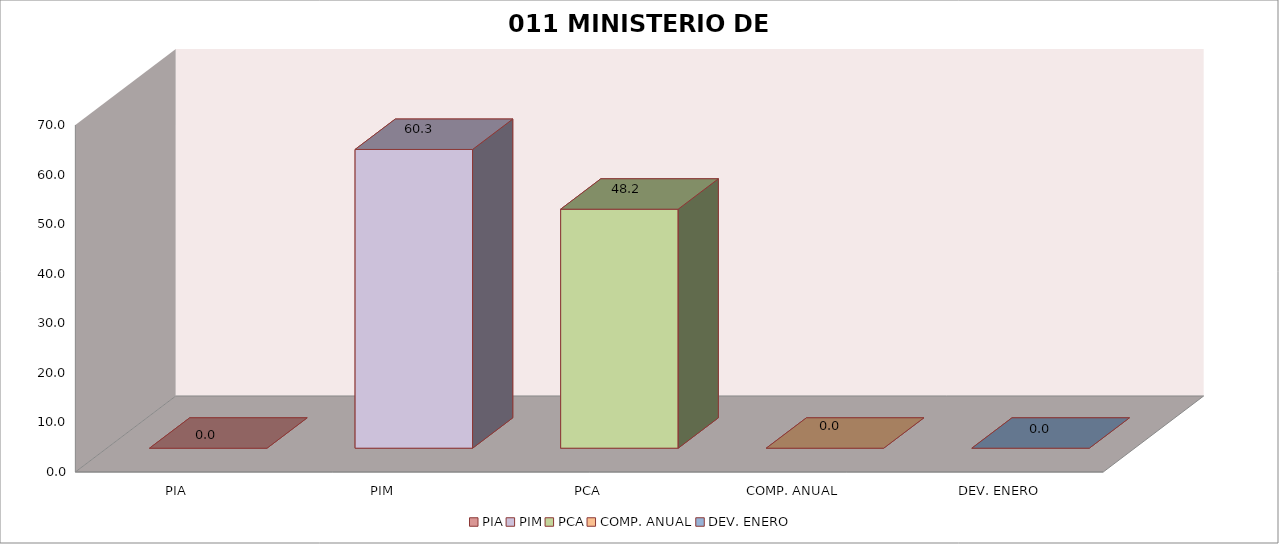
| Category | 011 MINISTERIO DE SALUD |
|---|---|
| PIA | 0 |
| PIM | 60.27 |
| PCA | 48.216 |
| COMP. ANUAL | 0 |
| DEV. ENERO | 0 |